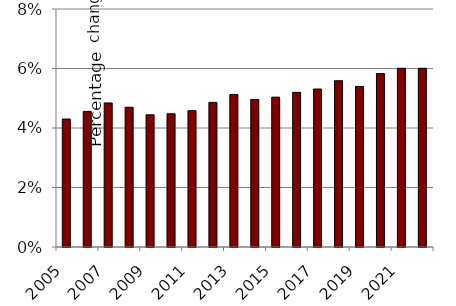
| Category | Series 0 |
|---|---|
| 2005.0 | 4.302 |
| 2006.0 | 4.558 |
| 2007.0 | 4.842 |
| 2008.0 | 4.697 |
| 2009.0 | 4.441 |
| 2010.0 | 4.478 |
| 2011.0 | 4.579 |
| 2012.0 | 4.861 |
| 2013.0 | 5.127 |
| 2014.0 | 4.96 |
| 2015.0 | 5.037 |
| 2016.0 | 5.199 |
| 2017.0 | 5.31 |
| 2018.0 | 5.588 |
| 2019.0 | 5.397 |
| 2020.0 | 5.828 |
| 2021.0 | 6.008 |
| 2022.0 | 6.008 |